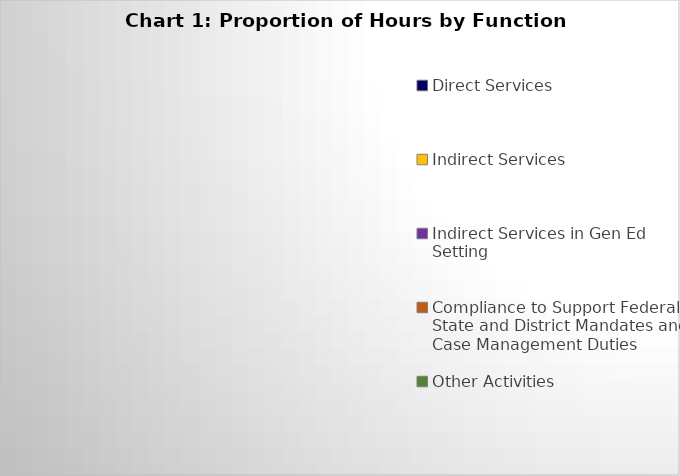
| Category | Series 0 |
|---|---|
| Direct Services | 0 |
| Indirect Services | 0 |
| Indirect Services in Gen Ed Setting | 0 |
| Compliance to Support Federal, State and District Mandates and Case Management Duties | 0 |
| Other Activities | 0 |